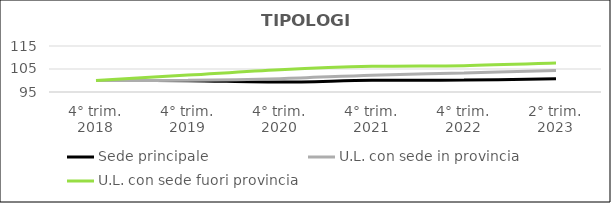
| Category | Sede principale | U.L. con sede in provincia | U.L. con sede fuori provincia |
|---|---|---|---|
| 4° trim.
2018 | 100 | 100 | 100 |
| 4° trim.
2019 | 99.901 | 100.082 | 102.344 |
| 4° trim.
2020 | 99.334 | 100.807 | 104.709 |
| 4° trim.
2021 | 100.09 | 102.324 | 106.153 |
| 4° trim.
2022 | 100.163 | 103.268 | 106.467 |
| 2° trim.
2023 | 100.708 | 104.348 | 107.576 |